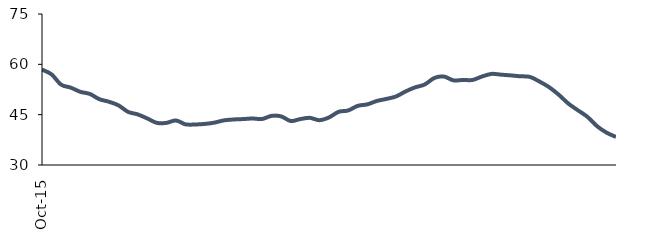
| Category | Series 0 |
|---|---|
| 2015-10-01 | 58.436 |
| 2015-11-01 | 57.005 |
| 2015-12-01 | 53.945 |
| 2016-01-01 | 53.062 |
| 2016-02-01 | 51.819 |
| 2016-03-01 | 51.169 |
| 2016-04-01 | 49.604 |
| 2016-05-01 | 48.856 |
| 2016-06-01 | 47.767 |
| 2016-07-01 | 45.831 |
| 2016-08-01 | 45.082 |
| 2016-09-01 | 43.878 |
| 2016-10-01 | 42.56 |
| 2016-11-01 | 42.549 |
| 2016-12-01 | 43.269 |
| 2017-01-01 | 42.12 |
| 2017-02-01 | 42.072 |
| 2017-03-01 | 42.238 |
| 2017-04-01 | 42.614 |
| 2017-05-01 | 43.29 |
| 2017-06-01 | 43.561 |
| 2017-07-01 | 43.687 |
| 2017-08-01 | 43.855 |
| 2017-09-01 | 43.713 |
| 2017-10-01 | 44.643 |
| 2017-11-01 | 44.49 |
| 2017-12-01 | 43.109 |
| 2018-01-01 | 43.687 |
| 2018-02-01 | 44.052 |
| 2018-03-01 | 43.35 |
| 2018-04-01 | 44.176 |
| 2018-05-01 | 45.845 |
| 2018-06-01 | 46.246 |
| 2018-07-01 | 47.626 |
| 2018-08-01 | 48.059 |
| 2018-09-01 | 49.077 |
| 2018-10-01 | 49.695 |
| 2018-11-01 | 50.418 |
| 2018-12-01 | 51.914 |
| 2019-01-01 | 53.132 |
| 2019-02-01 | 53.985 |
| 2019-03-01 | 55.911 |
| 2019-04-01 | 56.375 |
| 2019-05-01 | 55.228 |
| 2019-06-01 | 55.345 |
| 2019-07-01 | 55.345 |
| 2019-08-01 | 56.375 |
| 2019-09-01 | 57.152 |
| 2019-10-01 | 56.913 |
| 2019-11-01 | 56.704 |
| 2019-12-01 | 56.434 |
| 2020-01-01 | 56.256 |
| 2020-02-01 | 54.873 |
| 2020-03-01 | 53.212 |
| 2020-04-01 | 50.982 |
| 2020-05-01 | 48.355 |
| 2020-06-01 | 46.331 |
| 2020-07-01 | 44.38 |
| 2020-08-01 | 41.619 |
| 2020-09-01 | 39.667 |
| 2020-10-01 | 38.362 |